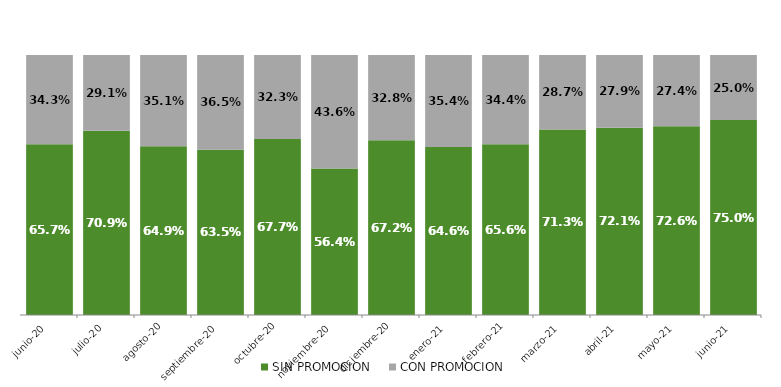
| Category | SIN PROMOCION   | CON PROMOCION   |
|---|---|---|
| 2020-06-01 | 0.657 | 0.343 |
| 2020-07-01 | 0.709 | 0.291 |
| 2020-08-01 | 0.649 | 0.351 |
| 2020-09-01 | 0.635 | 0.365 |
| 2020-10-01 | 0.677 | 0.323 |
| 2020-11-01 | 0.564 | 0.436 |
| 2020-12-01 | 0.672 | 0.328 |
| 2021-01-01 | 0.646 | 0.354 |
| 2021-02-01 | 0.656 | 0.344 |
| 2021-03-01 | 0.713 | 0.287 |
| 2021-04-01 | 0.721 | 0.279 |
| 2021-05-01 | 0.726 | 0.274 |
| 2021-06-01 | 0.75 | 0.25 |